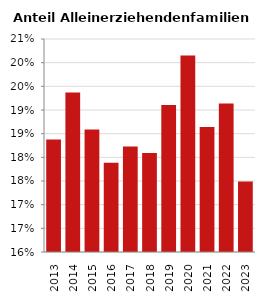
| Category | Anteil Alleinerziehende an Familien |
|---|---|
| 2013.0 | 0.184 |
| 2014.0 | 0.194 |
| 2015.0 | 0.186 |
| 2016.0 | 0.179 |
| 2017.0 | 0.182 |
| 2018.0 | 0.181 |
| 2019.0 | 0.191 |
| 2020.0 | 0.202 |
| 2021.0 | 0.186 |
| 2022.0 | 0.191 |
| 2023.0 | 0.175 |